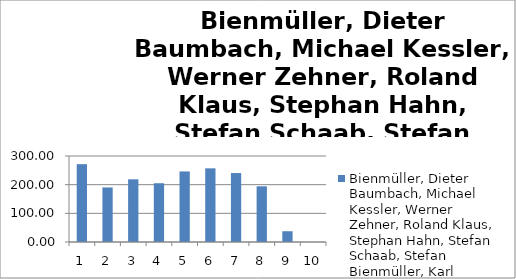
| Category | Bienmüller, Dieter Baumbach, Michael Kessler, Werner Zehner, Roland Klaus, Stephan Hahn, Stefan Schaab, Stefan Bienmüller, Karl Schubert, Andreas Martin, Michael |
|---|---|
| 0 | 271.53 |
| 1 | 190.34 |
| 2 | 218.66 |
| 3 | 205.02 |
| 4 | 246.12 |
| 5 | 256.92 |
| 6 | 240.53 |
| 7 | 194.19 |
| 8 | 37.54 |
| 9 | 0 |